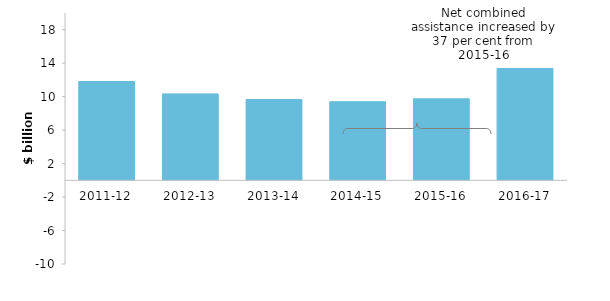
| Category | Net combined assistance |
|---|---|
| 2011-12 | 11.816 |
| 2012-13 | 10.331 |
| 2013-14 | 9.666 |
| 2014-15 | 9.397 |
| 2015-16 | 9.738 |
| 2016-17 | 13.368 |